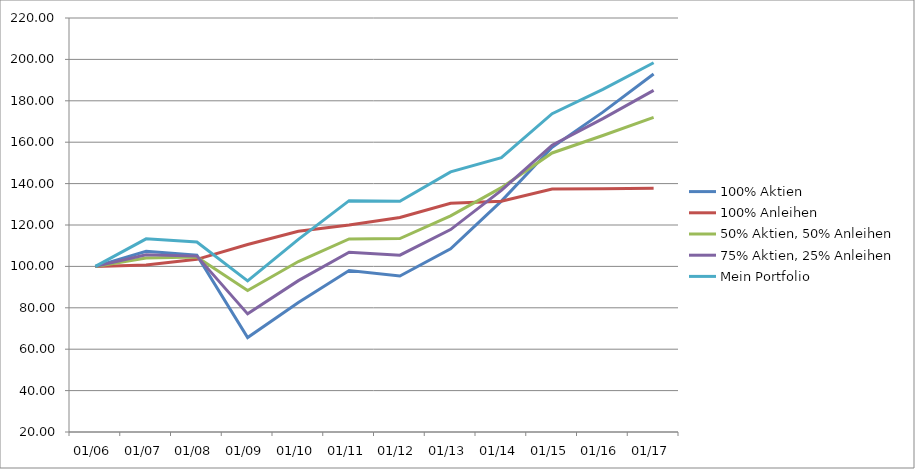
| Category | 100% Aktien | 100% Anleihen | 50% Aktien, 50% Anleihen | 75% Aktien, 25% Anleihen | Mein Portfolio |
|---|---|---|---|---|---|
| 01/06 | 100 | 100 | 100 | 100 | 100 |
| 01/07 | 107.3 | 100.7 | 104 | 105.65 | 113.306 |
| 01/08 | 105.412 | 103.419 | 104.489 | 104.969 | 111.749 |
| 01/09 | 65.629 | 110.555 | 88.377 | 77.068 | 93.025 |
| 01/10 | 82.588 | 116.967 | 102.358 | 93.121 | 113.088 |
| 01/11 | 98.056 | 120.008 | 113.274 | 106.807 | 131.765 |
| 01/12 | 95.386 | 123.608 | 113.431 | 105.427 | 131.435 |
| 01/13 | 108.506 | 130.53 | 124.408 | 117.779 | 145.639 |
| 01/14 | 131.524 | 131.444 | 138.039 | 136.723 | 152.485 |
| 01/15 | 157.534 | 137.359 | 154.794 | 158.54 | 173.795 |
| 01/16 | 174.521 | 137.496 | 163.217 | 171.402 | 185.488 |
| 01/17 | 192.935 | 137.771 | 171.991 | 185.051 | 198.382 |